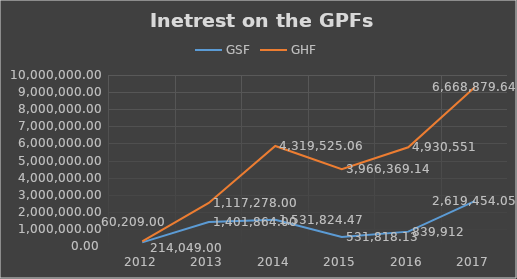
| Category | GSF | GHF |
|---|---|---|
| 2012.0 | 214049 | 60209 |
| 2013.0 | 1401864 | 1117278 |
| 2014.0 | 1531824.47 | 4319525.06 |
| 2015.0 | 531818.13 | 3966369.14 |
| 2016.0 | 839912 | 4930551 |
| 2017.0 | 2619454.05 | 6668879.64 |